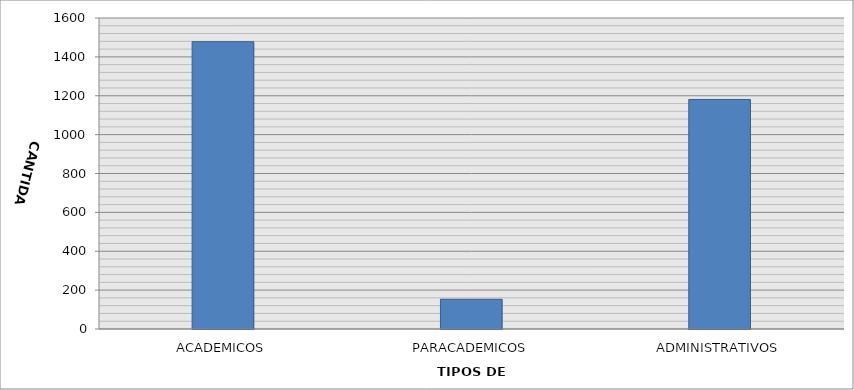
| Category | CANTIDAD |
|---|---|
| ACADEMICOS | 1478 |
| PARACADEMICOS | 153 |
| ADMINISTRATIVOS | 1181 |